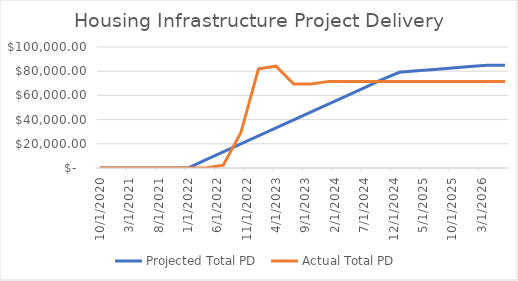
| Category | Projected Total PD  | Actual Total PD  |
|---|---|---|
| 10/1/20 | 0 | 0 |
| 1/1/21 | 0 | 0 |
| 4/1/21 | 0 | 0 |
| 7/1/21 | 0 | 0 |
| 10/1/21 | 0 | 0 |
| 1/1/22 | 0 | 0 |
| 4/1/22 | 6631.016 | 0 |
| 7/1/22 | 13262.032 | 2315 |
| 10/1/22 | 19893.048 | 29259 |
| 1/1/23 | 26524.064 | 81988 |
| 4/1/23 | 33155.08 | 84150 |
| 7/1/23 | 39786.096 | 69416 |
| 10/1/23 | 46417.112 | 69416 |
| 1/1/24 | 53048.128 | 71578 |
| 4/1/24 | 59679.144 | 71578 |
| 7/1/24 | 66310.16 | 71578 |
| 10/1/24 | 72941.176 | 71578 |
| 1/1/25 | 79117.647 | 71578 |
| 4/1/25 | 80294.118 | 71578 |
| 7/1/25 | 81470.588 | 71578 |
| 10/1/25 | 82647.059 | 71578 |
| 1/1/26 | 83823.529 | 71578 |
| 4/1/26 | 85000 | 71578 |
| 7/1/26 | 85000 | 71578 |